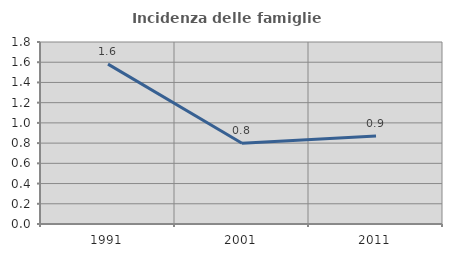
| Category | Incidenza delle famiglie numerose |
|---|---|
| 1991.0 | 1.581 |
| 2001.0 | 0.799 |
| 2011.0 | 0.871 |